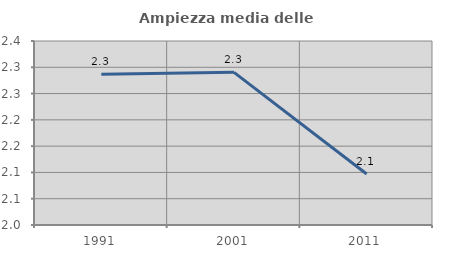
| Category | Ampiezza media delle famiglie |
|---|---|
| 1991.0 | 2.287 |
| 2001.0 | 2.29 |
| 2011.0 | 2.097 |